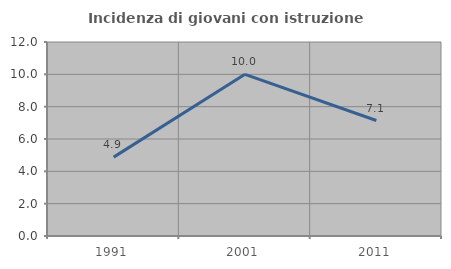
| Category | Incidenza di giovani con istruzione universitaria |
|---|---|
| 1991.0 | 4.878 |
| 2001.0 | 10 |
| 2011.0 | 7.143 |